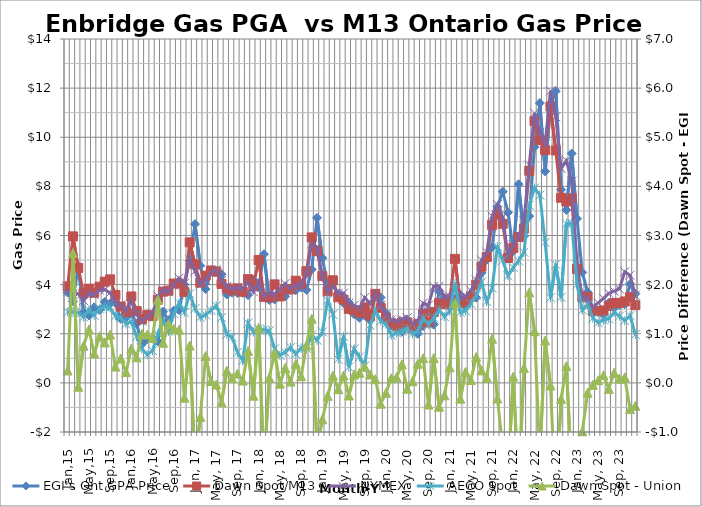
| Category | EGI's Ont GPA Price | Dawn Spot/M13 | NYMEX | AECO Spot |
|---|---|---|---|---|
| Jan,15 | 3.677 | 3.929 | 3.712 | 2.888 |
| Feb,15 | 3.322 | 5.965 | 3.608 | 2.888 |
| Mar,15 | 4.758 | 4.679 | 3.629 | 2.859 |
| Apr,15 | 2.882 | 3.639 | 3.348 | 2.678 |
| May,15 | 2.75 | 3.836 | 3.644 | 2.973 |
| Jun,15 | 3.074 | 3.673 | 3.584 | 2.749 |
| Jul,15 | 2.969 | 3.916 | 3.779 | 3.01 |
| Aug,15 | 3.297 | 4.12 | 3.791 | 3.099 |
| Sep,15 | 3.231 | 4.214 | 3.669 | 3.05 |
| Oct,15 | 3.249 | 3.581 | 3.266 | 2.729 |
| Nov,15 | 2.61 | 3.108 | 3.171 | 2.655 |
| Dec,15 | 2.667 | 2.888 | 2.935 | 2.402 |
| Jan,16 | 2.821 | 3.518 | 3.324 | 2.492 |
| Feb,16 | 2.406 | 2.927 | 2.787 | 1.884 |
| Mar,16 | 1.593 | 2.591 | 2.508 | 1.381 |
| Apr,16 | 1.775 | 2.758 | 2.704 | 1.148 |
| May,16 | 1.801 | 2.715 | 2.826 | 1.312 |
| Jun,16 | 1.69 | 3.385 | 3.542 | 1.992 |
| Jul,16 | 2.899 | 3.716 | 3.771 | 2.508 |
| Aug,16 | 2.551 | 3.752 | 3.707 | 2.1 |
| Sep,16 | 2.942 | 4.044 | 3.981 | 2.811 |
| Oct,16 | 2.962 | 4.045 | 4.266 | 3.26 |
| Nov,16 | 4.004 | 3.702 | 4.046 | 2.877 |
| Dec, 16 | 4.963 | 5.722 | 5.013 | 3.629 |
| Jan, 17 | 6.465 | 4.826 | 4.552 | 3.024 |
| Feb, 17 | 4.773 | 4.08 | 3.992 | 2.669 |
| Mar, 17 | 3.82 | 4.367 | 4.195 | 2.764 |
| Apr, 17 | 4.538 | 4.575 | 4.489 | 2.952 |
| May, 17 | 4.564 | 4.53 | 4.608 | 3.139 |
| Jun, 17 | 4.422 | 4.028 | 4.169 | 2.659 |
| Jul, 17 | 3.599 | 3.845 | 3.93 | 1.976 |
| Aug, 17 | 3.671 | 3.768 | 3.837 | 1.858 |
| Sep, 17 | 3.661 | 3.85 | 3.87 | 1.241 |
| Oct, 17 | 3.663 | 3.71 | 3.845 | 0.909 |
| Nov, 17 | 3.572 | 4.222 | 4.092 | 2.434 |
| Dec, 17 | 4.196 | 3.934 | 3.711 | 2.075 |
| Jan, 18 | 3.877 | 5.002 | 4.117 | 2.199 |
| Feb, 18 | 5.24 | 3.503 | 3.51 | 2.155 |
| Mar, 18 | 3.375 | 3.482 | 3.656 | 2.119 |
| Apr, 18 | 3.395 | 4.01 | 3.633 | 1.389 |
| May, 18 | 3.534 | 3.518 | 3.815 | 1.125 |
| Jun, 18 | 3.517 | 3.821 | 4.046 | 1.243 |
| Jul, 18 | 3.779 | 3.807 | 3.839 | 1.445 |
| Aug, 18 | 3.772 | 4.159 | 3.975 | 1.173 |
| Sep, 18 | 3.886 | 4.022 | 3.954 | 1.414 |
| Oct, 18 | 3.786 | 4.549 | 4.373 | 1.411 |
| Nov, 18 | 4.616 | 5.921 | 5.662 | 1.945 |
| Dec, 18 | 6.718 | 5.364 | 5.532 | 1.736 |
| Jan, 19 | 5.086 | 4.344 | 4.322 | 2.075 |
| Feb, 19 | 3.993 | 3.729 | 3.708 | 3.363 |
| Mar, 19 | 4.029 | 4.177 | 3.939 | 2.786 |
| Apr, 19 | 3.613 | 3.485 | 3.648 | 0.964 |
| May, 19 | 3.24 | 3.391 | 3.658 | 1.883 |
| Jun, 19 | 3.271 | 3.015 | 3.242 | 0.643 |
| Jul, 19 | 2.792 | 2.964 | 3.161 | 1.383 |
| Aug, 19 | 2.65 | 2.857 | 3.023 | 1.055 |
| Sep, 19 | 2.74 | 3.069 | 3.473 | 0.691 |
| Oct, 19 | 2.555 | 2.726 | 3.232 | 2.352 |
| Nov, 19 | 3.55 | 3.624 | 3.649 | 2.924 |
| Dec, 19 | 3.478 | 3.054 | 3.156 | 2.514 |
| Jan, 20 | 2.84 | 2.64 | 2.782 | 2.399 |
| Feb, 20 | 2.333 | 2.428 | 2.566 | 1.941 |
| Mar, 20 | 2.213 | 2.329 | 2.528 | 2.032 |
| Apr, 20 | 2.085 | 2.462 | 2.589 | 2.093 |
| May, 20 | 2.58 | 2.461 | 2.648 | 2.208 |
| Jun, 20 | 2.21 | 2.245 | 2.414 | 1.999 |
| Jul, 20 | 1.997 | 2.387 | 2.496 | 2.111 |
| Aug, 20 | 2.315 | 2.817 | 3.248 | 2.636 |
| Sep, 20 | 2.904 | 2.464 | 3.158 | 2.374 |
| Oct, 20 | 2.381 | 2.886 | 3.925 | 2.64 |
| Nov, 20 | 3.723 | 3.239 | 3.933 | 2.982 |
| Dec, 20 | 3.462 | 3.21 | 3.468 | 2.697 |
| Jan, 21 | 3.071 | 3.388 | 3.53 | 2.909 |
| Feb, 21 | 3.423 | 5.049 | 3.88 | 4.049 |
| Mar, 21 | 3.588 | 3.267 | 3.453 | 2.869 |
| Apr, 21 | 3.107 | 3.329 | 3.512 | 2.928 |
| May, 21 | 3.464 | 3.522 | 3.758 | 3.228 |
| Jun, 21 | 3.471 | 3.997 | 4.191 | 3.565 |
| Jul, 21 | 4.48 | 4.734 | 5.003 | 4.1 |
| Aug, 21 | 5.019 | 5.123 | 5.32 | 3.31 |
| Sep, 21 | 5.523 | 6.423 | 6.79 | 3.863 |
| Oct, 21 | 7.172 | 6.855 | 7.259 | 5.553 |
| Nov, 21 | 7.785 | 6.474 | 6.741 | 4.994 |
| Dec, 21 | 6.939 | 5.085 | 5.178 | 4.36 |
| Jan, 22 | 5.367 | 5.495 | 5.629 | 4.698 |
| Feb, 22 | 8.089 | 5.936 | 5.946 | 4.966 |
| Mar, 22 | 5.972 | 6.276 | 6.6 | 5.317 |
| Apr, 22 | 6.791 | 8.636 | 8.873 | 7.235 |
| May, 22 | 9.604 | 10.656 | 10.985 | 7.933 |
| Jun, 22 | 11.391 | 9.88 | 10.199 | 7.649 |
| Jul, 22 | 8.611 | 9.475 | 9.735 | 5.712 |
| Aug, 22 | 11.306 | 11.255 | 11.884 | 3.469 |
| Sep, 22 | 11.874 | 9.462 | 10.833 | 4.821 |
| Oct, 22 | 7.864 | 7.537 | 8.728 | 3.483 |
| Nov, 22 | 7.043 | 7.386 | 9.05 | 6.479 |
| Dec, 22 | 9.34 | 7.514 | 8.214 | 6.497 |
| Jan, 23 | 6.682 | 4.643 | 4.813 | 3.998 |
| Feb, 23 | 4.495 | 3.509 | 3.434 | 2.966 |
| Mar, 23 | 3.691 | 3.491 | 3.451 | 3.19 |
| Apr, 23 | 2.97 | 2.931 | 3.09 | 2.632 |
| May, 23 | 2.876 | 2.929 | 3.256 | 2.454 |
| Jun, 23 | 2.792 | 2.948 | 3.444 | 2.563 |
| Jul, 23 | 3.256 | 3.135 | 3.65 | 2.611 |
| Aug, 23 | 3.047 | 3.253 | 3.735 | 2.867 |
| Sep, 23 | 3.172 | 3.256 | 3.824 | 2.719 |
| Oct, 23 | 3.203 | 3.316 | 4.523 | 2.534 |
| Nov, 23 | 4.026 | 3.493 | 4.387 | 2.736 |
| Dec, 23 | 3.629 | 3.162 | 3.567 | 1.969 |